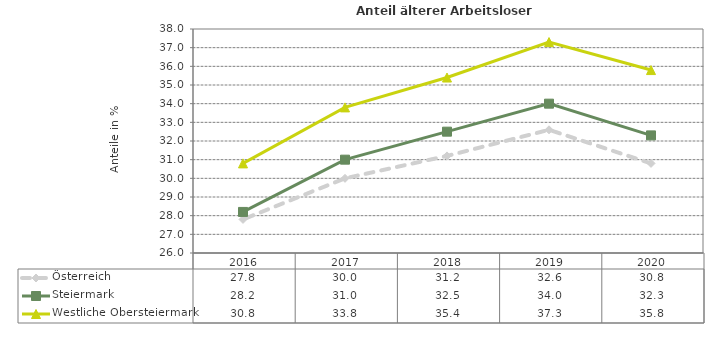
| Category | Österreich | Steiermark | Westliche Obersteiermark |
|---|---|---|---|
| 2020.0 | 30.8 | 32.3 | 35.8 |
| 2019.0 | 32.6 | 34 | 37.3 |
| 2018.0 | 31.2 | 32.5 | 35.4 |
| 2017.0 | 30 | 31 | 33.8 |
| 2016.0 | 27.8 | 28.2 | 30.8 |